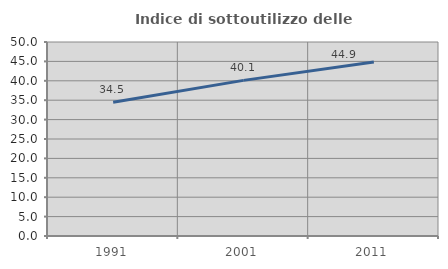
| Category | Indice di sottoutilizzo delle abitazioni  |
|---|---|
| 1991.0 | 34.483 |
| 2001.0 | 40.111 |
| 2011.0 | 44.872 |